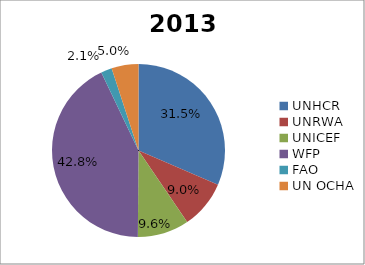
| Category | 2013 |
|---|---|
| UNHCR | 2299.287 |
| UNRWA | 659.811 |
| UNICEF | 703.369 |
| WFP | 3128.268 |
| FAO | 149.295 |
| UN OCHA | 367.509 |